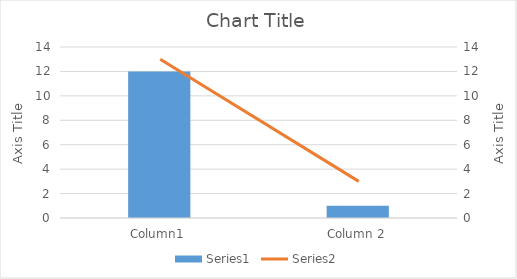
| Category | Series 0 |
|---|---|
| Column1 | 12 |
| Column 2 | 1 |